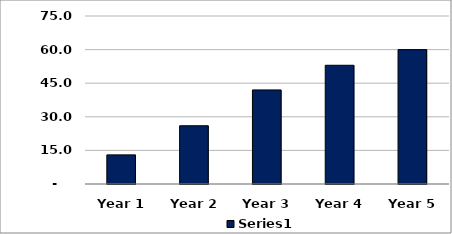
| Category | Series1 |
|---|---|
| Year 1 | 13 |
| Year 2 | 26 |
| Year 3 | 42 |
| Year 4 | 53 |
| Year 5 | 60 |